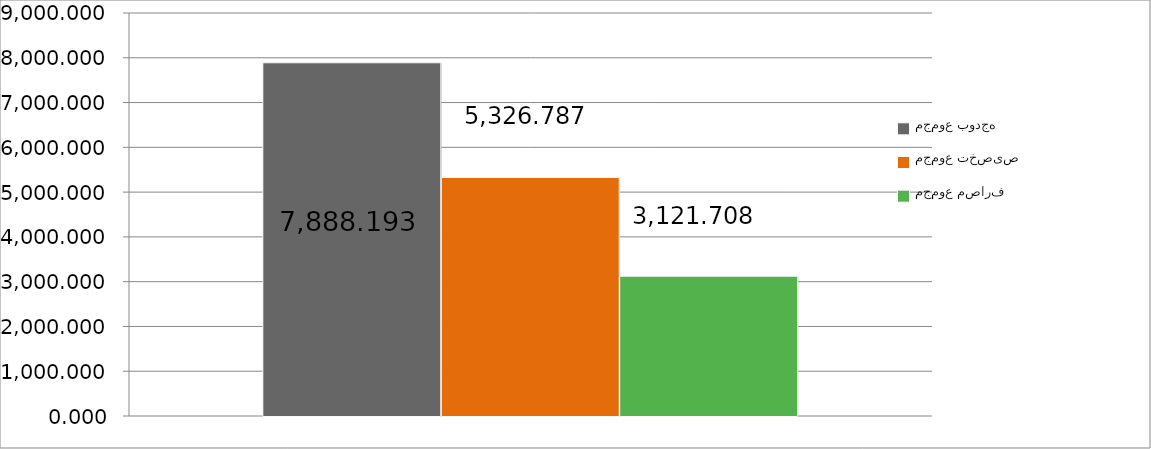
| Category | مجموع بودجه  | مجموع تخصیص | مجموع مصارف |
|---|---|---|---|
| 0 | 7888.193 | 5326.787 | 3121.708 |